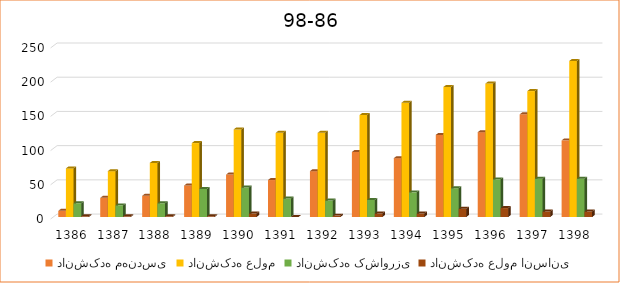
| Category | دانشکده مهندسی | دانشکده علوم | دانشکده کشاورزی | دانشکده علوم انسانی |
|---|---|---|---|---|
| 1386.0 | 9 | 71 | 20 | 1 |
| 1387.0 | 28 | 67 | 17 | 1 |
| 1388.0 | 31 | 79 | 20 | 1 |
| 1389.0 | 46 | 108 | 41 | 1 |
| 1390.0 | 62 | 128 | 43 | 5 |
| 1391.0 | 54 | 123 | 27 | 0 |
| 1392.0 | 67 | 123 | 24 | 2 |
| 1393.0 | 95 | 149 | 25 | 5 |
| 1394.0 | 86 | 167 | 36 | 5 |
| 1395.0 | 120 | 190 | 42 | 12 |
| 1396.0 | 124 | 195 | 55 | 13 |
| 1397.0 | 150 | 184 | 56 | 8 |
| 1398.0 | 112 | 228 | 56 | 8 |